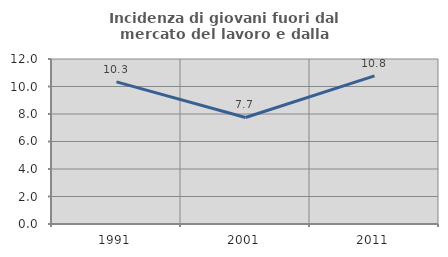
| Category | Incidenza di giovani fuori dal mercato del lavoro e dalla formazione  |
|---|---|
| 1991.0 | 10.334 |
| 2001.0 | 7.749 |
| 2011.0 | 10.769 |